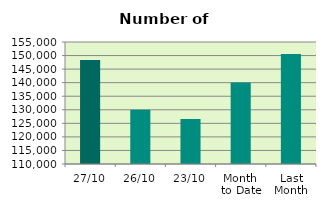
| Category | Series 0 |
|---|---|
| 27/10 | 148330 |
| 26/10 | 130030 |
| 23/10 | 126640 |
| Month 
to Date | 140053.474 |
| Last
Month | 150562.364 |